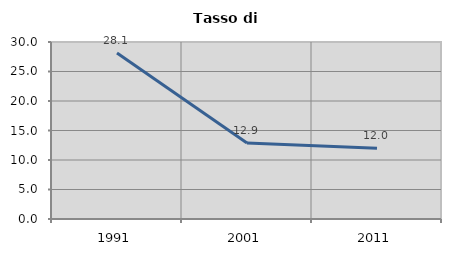
| Category | Tasso di disoccupazione   |
|---|---|
| 1991.0 | 28.125 |
| 2001.0 | 12.892 |
| 2011.0 | 11.993 |